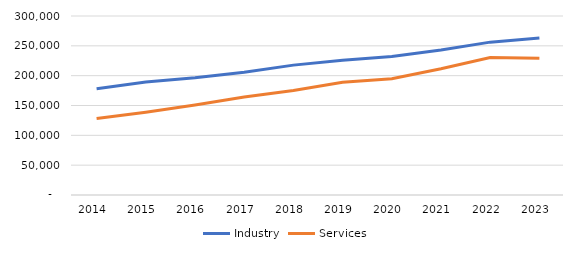
| Category | Industry | Services |
|---|---|---|
| 2014.0 | 178148 | 128083 |
| 2015.0 | 189368 | 138637 |
| 2016.0 | 196617 | 151013 |
| 2017.0 | 205827 | 164344 |
| 2018.0 | 217681 | 175206 |
| 2019.0 | 225871 | 188831 |
| 2020.0 | 232034 | 195007 |
| 2021.0 | 243102 | 211680 |
| 2022.0 | 256193 | 230321 |
| 2023.0 | 263075 | 229245 |